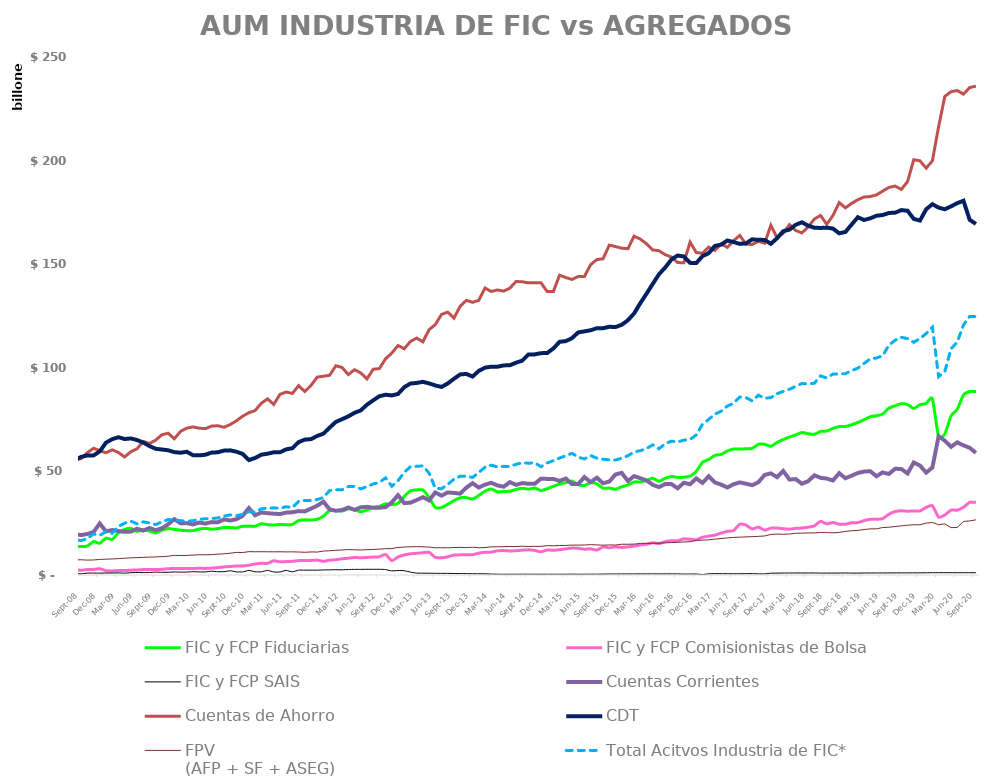
| Category | FIC y FCP Fiduciarias | FIC y FCP Comisionistas de Bolsa  | FIC y FCP SAIS | Cuentas Corrientes | Cuentas de Ahorro | CDT | FPV 
(AFP + SF + ASEG) | Total Acitvos Industria de FIC*  |
|---|---|---|---|---|---|---|---|---|
| 2008-01-01 | 12132808.79 | 2121832.26 | 544957.64 | 19249897.427 | 56056210.717 | 44941279.529 | 6945547.417 | 14799598.69 |
| 2008-02-01 | 12289879.65 | 2209666.7 | 519406.62 | 19213144.763 | 58419307.534 | 46482106.381 | 6986252.995 | 15018952.97 |
| 2008-03-01 | 12539377.12 | 2365642.48 | 580026.4 | 19370655.062 | 58209076.429 | 46770117.743 | 7003508.339 | 15485046 |
| 2008-04-01 | 12741364.47 | 2282972.94 | 561624.36 | 19492288.329 | 56874678.086 | 50148441.992 | 7150454.725 | 15585961.77 |
| 2008-05-01 | 12829643.03 | 2496281.61 | 662058.6 | 18663722.507 | 55639744.889 | 50761825.818 | 7208344.175 | 15987983.24 |
| 2008-06-01 | 12830951.12 | 2449742.03 | 701874.68 | 20003271.69 | 54847359.853 | 52034374.991 | 7166940.12 | 15982567.83 |
| 2008-07-01 | 13541278.95 | 2558464.4 | 754965.98 | 20342547.222 | 55678115.649 | 53125364.529 | 7175159.671 | 16854709.33 |
| 2008-08-01 | 13772968.36 | 2624403.07 | 815049.75 | 19770767.165 | 56148266.184 | 55348186.864 | 7294900.84 | 17212421.18 |
| 2008-09-01 | 13734669.578 | 2310280.49 | 544732.35 | 19250250.046 | 56145402.999 | 57015473.451 | 7349973.229 | 16589682.418 |
| 2008-10-01 | 13953414.868 | 2633334.91 | 921341.15 | 19804369.956 | 58986747.367 | 57700276.163 | 7188191.891 | 17508090.928 |
| 2008-11-01 | 16163521.832 | 2705717.241 | 932219.524 | 20735409.062 | 61155619.251 | 57692228.019 | 7246974.689 | 19801458.597 |
| 2008-12-01 | 15284899.058 | 2999156.471 | 891716.476 | 24887321.444 | 60019672.799 | 59648963.504 | 7516031.999 | 19175772.005 |
| 2009-01-01 | 17792239.172 | 2100542.66 | 962439.26 | 21040089.438 | 58999367.687 | 63877394.025 | 7647629.694 | 20855221.092 |
| 2009-02-01 | 17194217.152 | 1967140.68 | 956293.14 | 21714869.41 | 60405778.82 | 65534380.712 | 7751657.459 | 20117650.972 |
| 2009-03-01 | 20337363.88 | 2134644.38 | 1012448.54 | 21229406.812 | 59137277.4 | 66499801.412 | 7903642.968 | 23484456.8 |
| 2009-04-01 | 21958761.164 | 2138631.81 | 896627.12 | 20817553.96 | 56964966.372 | 65635299.329 | 8099376.93 | 24994020.094 |
| 2009-05-01 | 22513996.419 | 2336055.3 | 1121578.42 | 20961604.211 | 59492776.482 | 65895170.219 | 8286121.084 | 25971630.139 |
| 2009-06-01 | 21046486.068 | 2448437.58 | 1248642.13 | 22321940.134 | 60913043.271 | 65133059.461 | 8385600.015 | 24743565.778 |
| 2009-07-01 | 21871781.17 | 2623440.68 | 1149701.35 | 21420752.429 | 64486469.469 | 63910383.949 | 8522248.082 | 25644923.2 |
| 2009-08-01 | 21188789.878 | 2709594.68 | 1206713.71 | 22688223.969 | 63475807.938 | 62251898.303 | 8613906.771 | 25105098.268 |
| 2009-09-01 | 20280820.943 | 2658291.05 | 1386121.35 | 21673686.686 | 65073515.135 | 60908624.489 | 8719243.902 | 24325233.343 |
| 2009-10-01 | 21608487.093 | 2725247.27 | 1290257.29 | 22525547.45 | 67672284.07 | 60562742.887 | 8861759.81 | 25623991.653 |
| 2009-11-01 | 22396153.656 | 3044545.31 | 1317226.5 | 24455054.889 | 68440998.474 | 60197481.156 | 9068046.526 | 26757925.466 |
| 2009-12-01 | 22031134.901 | 3106700.35 | 1468565.02 | 26967356.932 | 65747994.242 | 59311640.164 | 9469304.205 | 26606400.271 |
| 2010-01-01 | 21639369.678 | 3179311.49 | 1383329.28 | 24954039.431 | 69305725.954 | 59022895.072 | 9433451.602 | 26202010.448 |
| 2010-02-01 | 21372785.209 | 3169119.85 | 1423495.84 | 25049574.137 | 70880759.204 | 59472247.066 | 9452309.941 | 25965400.899 |
| 2010-03-01 | 21434402.584 | 3174174.41 | 1594227.95 | 24420636.902 | 71469459.614 | 57851242.755 | 9611509.694 | 26202804.944 |
| 2010-04-01 | 22143243.751 | 3212727.75 | 1475837.14 | 25301982.328 | 70847211.96 | 57735039.025 | 9778654.214 | 26831808.641 |
| 2010-05-01 | 22503307.867 | 3190200.84 | 1483983.1 | 24812065.229 | 70645167.236 | 58048404.335 | 9744618.09 | 27177491.807 |
| 2010-06-01 | 22108087.545 | 3329038.91 | 1824933.45 | 25526414.201 | 71856536.453 | 59077438.758 | 9809143.264 | 27262059.905 |
| 2010-07-01 | 22375035.018 | 3572124.43 | 1568907.5 | 25422219.387 | 72032667.79 | 59235603.294 | 10060626.167 | 27516066.948 |
| 2010-08-01 | 22916586.47 | 3900515.32 | 1614182.63 | 26846242.145 | 71298447.382 | 60053578.291 | 10224850.699 | 28431284.42 |
| 2010-09-01 | 22872109.022 | 4099833.03 | 2037298.42 | 26290119.128 | 72611229.804 | 60156407.545 | 10513688.388 | 29009240.472 |
| 2010-10-01 | 22738234.3 | 4334389.78 | 1510252.83 | 26915819.282 | 74425012.581 | 59484867.202 | 10923089.827 | 28582876.91 |
| 2010-11-01 | 23509021.497 | 4340862.77 | 1483729.95 | 28542298.222 | 76665094.553 | 58441211.555 | 10834942.436 | 29333614.217 |
| 2010-12-01 | 23562424.684 | 4742999.64 | 2220193.91 | 32321078.595 | 78306142.612 | 55481322.699 | 11287314.204 | 30525618.234 |
| 2011-01-01 | 23495462.935 | 5289330.33 | 1556608.79 | 28820282.353 | 79376902.142 | 56468354.569 | 11207478.664 | 30341402.055 |
| 2011-02-01 | 24756664.566 | 5671618.52 | 1557593.58 | 30139906.351 | 82855125.664 | 58066057.51 | 11241368.84 | 31985876.666 |
| 2011-03-01 | 24274171.983 | 5632171 | 2217657.92 | 29838743.535 | 85010576 | 58536112.765 | 11202074.386 | 32124000.903 |
| 2011-04-01 | 24079345.463 | 6874755.37 | 1459776.52 | 29601505.07 | 82318818.989 | 59218987.736 | 11186753.753 | 32413877.353 |
| 2011-05-01 | 24377123.84 | 6341089.37 | 1476727.22 | 29409468.572 | 87172125.694 | 59206285.34 | 11220777.412 | 32194940.43 |
| 2011-06-01 | 24231078.42 | 6497028.02 | 2208092.5 | 30092330.237 | 88317380.74 | 60632244.817 | 11151147.79 | 32936198.94 |
| 2011-07-01 | 24434485.473 | 6608224.15 | 1531324.1 | 30282648.215 | 87627158.97 | 61184870.919 | 11176095.923 | 32574033.723 |
| 2011-08-01 | 26259447.52 | 6935490.17 | 2337915.55 | 30841103.551 | 91374682.8 | 64138804.274 | 11105936.296 | 35532853.24 |
| 2011-09-01 | 26623402.24 | 7041608 | 2322454.44 | 30699988.434 | 88529234.728 | 65335826.716 | 10964113.148 | 35987464.68 |
| 2011-10-01 | 26508006.996 | 7048002.36 | 2350293.45 | 32047983.66 | 91517505.226 | 65586962.022 | 11133132.15 | 35906302.806 |
| 2011-11-01 | 26909737.637 | 7192733.79 | 2342058.33 | 33456111.369 | 95502293.755 | 67109432.547 | 11074843.165 | 36444529.757 |
| 2011-12-01 | 28364982 | 6564786 | 2446719 | 35393548 | 95919744 | 68235861 | 11546595.74 | 37376487 |
| 2012-01-01 | 31131719 | 7180505 | 2478839 | 31668037.398 | 96429813.54 | 71134244.387 | 11708431.684 | 40791063 |
| 2012-02-01 | 31147275 | 7394169 | 2567975 | 31007469.335 | 101002712.63 | 73897067.082 | 11919293.346 | 41109419 |
| 2012-03-01 | 30833181 | 7823743 | 2510077 | 31372893 | 100150619 | 75192619 | 12082910.478 | 41167001 |
| 2012-04-01 | 31932047.65 | 8092229 | 2636558 | 32563742.234 | 96711407.203 | 76553414.137 | 12289106.986 | 42660834.65 |
| 2012-05-01 | 31562405.39 | 8467811 | 2716675 | 31445716.846 | 99087467.96 | 78272819.151 | 12156412.148 | 42746891.39 |
| 2012-06-01 | 30524721 | 8309508 | 2714337 | 32652205 | 97535090 | 79427656 | 12058126.88 | 41548566 |
| 2012-07-01 | 31384745 | 8476043 | 2753609 | 32914215.201 | 94633321.372 | 82178131.299 | 12231491.476 | 42614397 |
| 2012-08-01 | 32556264.125 | 8636341.39 | 2741827.01 | 32473082.673 | 99284188.863 | 84293159.574 | 12345156.611 | 43934432.525 |
| 2012-09-01 | 33120247 | 8786891 | 2754338 | 32485301.148 | 99622220.756 | 86273608.494 | 12470152.972 | 44661476 |
| 2012-10-01 | 34338711 | 9924835 | 2621952 | 32757672.42 | 104358590.858 | 87001274.106 | 12720740.166 | 46885498 |
| 2012-11-01 | 33938618 | 6897363 | 1988330 | 35055250.43 | 107111414.949 | 86660359.79 | 12745871.11 | 42824311 |
| 2012-12-01 | 34561616 | 8728627 | 2179791 | 38535455.952 | 110750588.805 | 87369641.716 | 13299299.104 | 45470034 |
| 2013-01-01 | 37836891 | 9651351 | 2068186 | 34709885.184 | 109182797.981 | 90615049.292 | 13509250.551 | 49556428 |
| 2013-02-01 | 40632956.33 | 10231474 | 1400201 | 34899680.619 | 112707815.094 | 92434040.154 | 13607848.915 | 52264631.33 |
| 2013-03-01 | 41069868 | 10463859 | 912927 | 36164862.111 | 114356257.363 | 92680012.269 | 13671877.605 | 52446654 |
| 2013-04-01 | 41043734 | 10736529 | 867910 | 37556322.05 | 112533114.733 | 93226256.238 | 13626257.475 | 52648173 |
| 2013-05-01 | 37372662.65 | 10950463 | 857331 | 36017787.759 | 118386119.194 | 92468633.061 | 13484574.137 | 49180456.65 |
| 2013-06-01 | 32613179 | 8493261 | 808179 | 39842306.408 | 120861072.922 | 91484124.39 | 13139969.891 | 41914619 |
| 2013-07-01 | 32539415 | 8294683 | 794522 | 38314923.667 | 125752507.028 | 90763716.528 | 13164680.049 | 41628620 |
| 2013-08-01 | 34114942.963 | 8807642.89 | 778363.4 | 39857916.017 | 126871339.693 | 92441495.764 | 13138412.03 | 43700949.253 |
| 2013-09-01 | 35884012 | 9612656 | 733729 | 39603634.773 | 123946270.663 | 94694686.716 | 13248237.194 | 46230397 |
| 2013-10-01 | 37250894 | 9715070 | 678939 | 39272659.973 | 129674911.513 | 96800721.471 | 13368711.223 | 47644903 |
| 2013-11-01 | 37318372.93 | 9735967.95 | 660905.93 | 42179693.943 | 132565745.258 | 97042379.372 | 13213562.109 | 47715246.81 |
| 2013-12-01 | 36647206.822 | 9781706.51 | 627244.94 | 44300089.672 | 131616929.6 | 95773066.764 | 13412280.346 | 47056158.272 |
| 2014-01-01 | 38369903.334 | 10557268.53 | 595392.99 | 42230304 | 132558811 | 98518081 | 13141330.376 | 49522564.854 |
| 2014-02-01 | 40449101.764 | 10954202.7 | 588536.56 | 43599724.41 | 138509031.454 | 100065132.396 | 13233550.635 | 51991841.024 |
| 2014-03-01 | 41519630.114 | 11027301.95 | 470068.23 | 44500844.044 | 136817273.962 | 100541868.899 | 13584518.658 | 53017000.294 |
| 2014-04-01 | 40116498 | 11657872 | 385729 | 43231698.1 | 137554847.305 | 100516933.788 | 13615476.315 | 52160099 |
| 2014-05-01 | 40315151.32 | 11776989.97 | 345001.78 | 42585585.256 | 137008074.28 | 101154120.942 | 13660673.832 | 52437143.07 |
| 2014-06-01 | 40416098.89 | 11579961.3 | 371228.88 | 44817124.428 | 138429028.965 | 101220614.506 | 13743144.418 | 52367289.07 |
| 2014-07-01 | 41316797 | 11715729 | 375325 | 43521000 | 141652000 | 102464000 | 13715305.865 | 53407851 |
| 2014-08-01 | 41855731.708 | 11985721.68 | 391319.12 | 44347000 | 141508000 | 103457000 | 13905242.744 | 54232772.508 |
| 2014-09-01 | 41411891.289 | 12137558.48 | 380927.6 | 44025212.782 | 141003775.677 | 106475441.817 | 13762483.464 | 53930377.369 |
| 2014-10-01 | 41975634 | 11856857 | 377516 | 44025212.782 | 141003775.677 | 106475441.817 | 13795830.272 | 54210007 |
| 2014-11-01 | 40740001.671 | 11158123 | 368897 | 46462368.859 | 141050657.705 | 107070411.692 | 13829598.92 | 52267021.671 |
| 2014-12-01 | 41656654.292 | 12075430.7 | 368901.58 | 46381000 | 136815000 | 107117082.017 | 14167694.014 | 54100986.572 |
| 2015-01-01 | 42829367 | 11943981 | 361106 | 46380640.852 | 136815012.002 | 109331074.058 | 14105770.897 | 55134454 |
| 2015-02-01 | 43906014 | 12174662 | 377946 | 45389931.566 | 144696890.023 | 112547249.862 | 14245271.387 | 56458622 |
| 2015-03-01 | 44527590 | 12624685 | 373755 | 46556394.03 | 143546680.679 | 112885686.92 | 14238413.855 | 57526030 |
| 2015-04-01 | 45347838 | 12968209 | 400026 | 43882131.877 | 142640978.203 | 114295912.468 | 14432998.432 | 58716073 |
| 2015-05-01 | 43602206.437 | 12870169 | 379934 | 43868330.885 | 144067660.411 | 117095747.48 | 14423377.487 | 56852309.437 |
| 2015-06-01 | 43184659.116 | 12456297 | 378882 | 47269216.705 | 144099449.315 | 117576199.725 | 14467508.121 | 56019838.116 |
| 2015-07-01 | 44614821.846 | 12629777 | 394228 | 44824893.119 | 149762182.064 | 118118438.808 | 14663702.588 | 57638826.846 |
| 2015-08-01 | 43989076.157 | 12009130 | 397232 | 46961211.638 | 152216129.231 | 119114602.082 | 14529265.46 | 56395438.157 |
| 2015-09-01 | 41857276.437 | 13554913 | 440374 | 44277600.072 | 152612486.174 | 119116749.002 | 14379522.061 | 55852563.437 |
| 2015-10-01 | 41966985 | 13118659.51 | 501533 | 45094005.049 | 159196192.021 | 119793024.514 | 14509464.447 | 55587177.51 |
| 2015-11-01 | 41365255 | 13619238 | 502481 | 48513369.195 | 158519924.955 | 119681100.359 | 14468322.769 | 55486974 |
| 2015-12-01 | 42558876.345 | 13300169 | 516569 | 49285505.594 | 157725448.27 | 120756047.93 | 14848609.659 | 56375614.345 |
| 2016-01-01 | 43472183 | 13579289 | 517684 | 45368735.999 | 157475605.492 | 122975254.619 | 14825068.35 | 57569156 |
| 2016-02-01 | 44904961.572 | 13948131 | 526504 | 47744020.678 | 163541609.018 | 126254546.723 | 14915465.741 | 59379596.572 |
| 2016-03-01 | 44921377.27 | 14526538 | 551021 | 46707243.646 | 162117145.793 | 131244339.223 | 15223556.252 | 59998936.27 |
| 2016-04-01 | 45667420 | 14828090 | 550022 | 45621999.683 | 159833273.331 | 135771123.5 | 15263360.655 | 61045532 |
| 2016-05-01 | 46726726.617 | 15560816 | 551107 | 43514447.944 | 156878031.239 | 140527045.012 | 15313185.27 | 62838649.617 |
| 2016-06-01 | 45222447.609 | 15141673 | 547564 | 42434113.352 | 156521975.202 | 145130344.445 | 15357677.844 | 60911684.609 |
| 2016-07-01 | 46710606.529 | 16108722 | 553440 | 43891948.187 | 154596652.035 | 148404415.743 | 15528129.989 | 63372768.529 |
| 2016-08-01 | 47512415 | 16527322 | 562941 | 43890420.74 | 153476072.003 | 152277396.699 | 15646521.009 | 64602678 |
| 2016-09-01 | 47102022.877 | 16559309 | 549077 | 41863341.532 | 150778144.586 | 154187082.647 | 15773427.906 | 64210408.877 |
| 2016-10-01 | 47168514.542 | 17435641 | 460432 | 44505224.349 | 150721044.65 | 153731885.974 | 15947295.967 | 65064587.542 |
| 2016-11-01 | 47718064 | 17243897 | 464614 | 43803723.471 | 160646159.221 | 150647315.539 | 16070122.225 | 65426575 |
| 2016-12-01 | 50077108.765 | 17024827 | 481553 | 46616292.021 | 155649773.745 | 150549237.17 | 16686648.639 | 67583488.765 |
| 2017-01-01 | 54368178.505 | 18181608 | 222152 | 44442010.194 | 155244726.496 | 153886811.688 | 16818695.993 | 72771938.505 |
| 2017-02-01 | 55762190.181 | 18776174.177 | 579714.85 | 47657415.777 | 158251548.569 | 155310289.15 | 16972857.277 | 75118079.208 |
| 2017-03-01 | 57747289.049 | 19241862.357 | 655367.902 | 44697365.002 | 156647290.937 | 158821173.031 | 17322864.933 | 77644519.308 |
| 2017-04-01 | 58164520 | 20227683 | 641508 | 43616908.455 | 159780567.33 | 159434119.369 | 17610744.228 | 79033711 |
| 2017-05-01 | 59841564 | 21050779 | 628347 | 42239864.757 | 158115214.364 | 161414965.04 | 17897354.211 | 81520690 |
| 2017-06-01 | 60786454.012 | 21451129.062 | 628314.626 | 43810127.154 | 161349013.039 | 160671195.131 | 18136078.113 | 82865897.7 |
| 2017-07-01 | 60816180.783 | 24476364.089 | 632988.556 | 44691718.554 | 163885549.644 | 159803990.507 | 18261453.112 | 85925533.428 |
| 2017-08-01 | 60902525 | 24058592 | 631625 | 44054660.814 | 159638000 | 160059000 | 18386706.881 | 85592742 |
| 2017-09-01 | 61127629 | 22219060 | 673578 | 43330054.008 | 159527528.2 | 161996651.348 | 18508890.927 | 84020267 |
| 2017-10-01 | 63105115.683 | 23122990 | 561905 | 44789028.673 | 161040018.386 | 161758053.274 | 18651311.322 | 86790010.683 |
| 2017-11-01 | 63102535 | 21640090 | 566184 | 48308003.562 | 160113329.651 | 161726673.163 | 18839024.719 | 85308809 |
| 2017-12-01 | 62127325 | 22603730 | 875331 | 49040782.522 | 168742902.483 | 159841329.569 | 19576385.715 | 85606386 |
| 2018-01-01 | 63938242 | 22648623 | 879678 | 47216931.732 | 162781465.049 | 162535157.785 | 19748025.204 | 87466543 |
| 2018-02-01 | 65357837 | 22320847 | 950750 | 50174200.241 | 164930800.368 | 165943798.481 | 19669969.384 | 88629434 |
| 2018-03-01 | 66580958 | 22111577 | 954371 | 46064458.079 | 169103161.446 | 166672653.203 | 19802479.283 | 89646906 |
| 2018-04-01 | 67605714 | 22478848 | 983710 | 46287698.831 | 166258678.919 | 169010131.166 | 20119796.013 | 91068272 |
| 2018-05-01 | 68783686 | 22674488 | 970461 | 44034361.721 | 165106317.223 | 170232145.256 | 20203862.672 | 92428635 |
| 2018-06-01 | 68179383 | 23064433 | 977571 | 45282598.338 | 167988914.573 | 168605713.635 | 20307291.936 | 92221387 |
| 2018-07-01 | 67891332.876 | 23695065 | 981550 | 48090725.791 | 171789954.916 | 167623407.946 | 20321726.758 | 92567947.876 |
| 2018-08-01 | 69290394.916 | 25889867 | 916282 | 46892865.731 | 173528210.847 | 167494515.744 | 20496962.068 | 96096543.916 |
| 2018-09-01 | 69468408 | 24695139 | 918203 | 46545235.243 | 169253761.111 | 167650153.722 | 20484787.245 | 95081750 |
| 2018-10-01 | 70752372.545 | 25303024 | 923856 | 45619808.862 | 173540048.109 | 167193109.497 | 20349410.39 | 96979252.545 |
| 2018-11-01 | 71596777 | 24525057 | 936854 | 49168133.858 | 179733646.903 | 164906615.194 | 20551807.323 | 97058688 |
| 2018-12-01 | 71679839 | 24525616 | 982589 | 46701780.579 | 177202446.744 | 165546553.572 | 21038534.051 | 97188044 |
| 2019-01-01 | 72479982 | 25224946 | 913635 | 47919007.538 | 179357673.563 | 169137227.662 | 21352471.029 | 98618563 |
| 2019-02-01 | 73642869 | 25291314 | 915329 | 49251446.721 | 181126226.127 | 172655618.131 | 21509245.731 | 99849512 |
| 2019-03-01 | 74925058 | 26249781 | 953344 | 49915673.748 | 182418243.406 | 171353531.629 | 21952152 | 102128183 |
| 2019-04-01 | 76387191 | 26901659 | 984140 | 50098154.109 | 182670636.205 | 172132365.456 | 22277971 | 104272990 |
| 2019-05-01 | 76851157.52 | 26901659 | 984140 | 47668839.935 | 183449047.246 | 173388676.147 | 22277971 | 104736956.52 |
| 2019-06-01 | 77670420 | 27188020 | 990243 | 49503365.541 | 185288152.785 | 173744511.023 | 22897709 | 105848683 |
| 2019-07-01 | 80565138.336 | 29333372 | 1008806 | 48777078.865 | 187040794.645 | 174724088.504 | 23064609 | 110907316.336 |
| 2019-08-01 | 81665926 | 30619880 | 1026967 | 51259181.407 | 187718162.039 | 174863760.82 | 23392445 | 113312773 |
| 2019-09-01 | 82690421 | 31003788 | 1024257 | 51167798.313 | 186094828.693 | 176108385.563 | 23715691 | 114718466 |
| 2019-10-01 | 82266738 | 30781025 | 1039920 | 48995503.076 | 189857556.141 | 175798830.418 | 24030558 | 114087683 |
| 2019-11-01 | 80353973 | 30911689 | 1047092 | 54284893.549 | 200422018.163 | 171857691.006 | 24244735 | 112312754 |
| 2019-12-01 | 82151903.071 | 30911689 | 1047092 | 52830252.44 | 199894729.527 | 171064162.485 | 24244735 | 114110684.071 |
| 2020-01-01 | 82805198 | 32656201 | 1074419 | 49409711.466 | 196356438.807 | 176524939.06 | 25050286 | 116535818 |
| 2020-02-01 | 85032535 | 33436183 | 1114435 | 51895139.317 | 199894729.527 | 178952079.989 | 25329244 | 119583153 |
| 2020-03-01 | 66653380 | 27922541 | 1119686 | 66994716.314 | 216350021.864 | 177306532.246 | 24258651 | 95695607 |
| 2020-04-01 | 68067849 | 28967912 | 1128656 | 64826202.461 | 230976315.947 | 176509180.865 | 24675238 | 98164417 |
| 2020-05-01 | 76776524 | 31299813 | 1114186 | 61861996.807 | 233257059.364 | 177928893.453 | 22851890 | 109190523 |
| 2020-06-01 | 79968756.495 | 31299813 | 1114186 | 64007790.448 | 233812487.66 | 179459613.807 | 22959453 | 112382755.495 |
| 2020-07-01 | 86857765.406 | 32706648 | 1117287 | 62556185.128 | 232065276.196 | 180637653.77 | 25855140 | 120681700.406 |
| 2020-08-01 | 88569202.283 | 35064168 | 1107439 | 61386319.533 | 235247476.878 | 171446008.642 | 26100716 | 124740809.283 |
| 2020-09-01 | 88569202.283 | 35064168 | 1107439 | 58923624.375 | 235949000.32 | 169443256.217 | 26631590.973 | 124740809.283 |